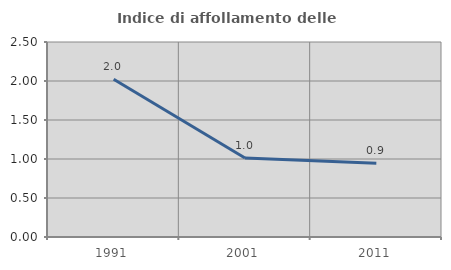
| Category | Indice di affollamento delle abitazioni  |
|---|---|
| 1991.0 | 2.022 |
| 2001.0 | 1.012 |
| 2011.0 | 0.945 |